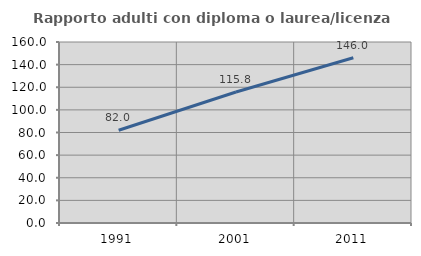
| Category | Rapporto adulti con diploma o laurea/licenza media  |
|---|---|
| 1991.0 | 82.011 |
| 2001.0 | 115.81 |
| 2011.0 | 146.021 |